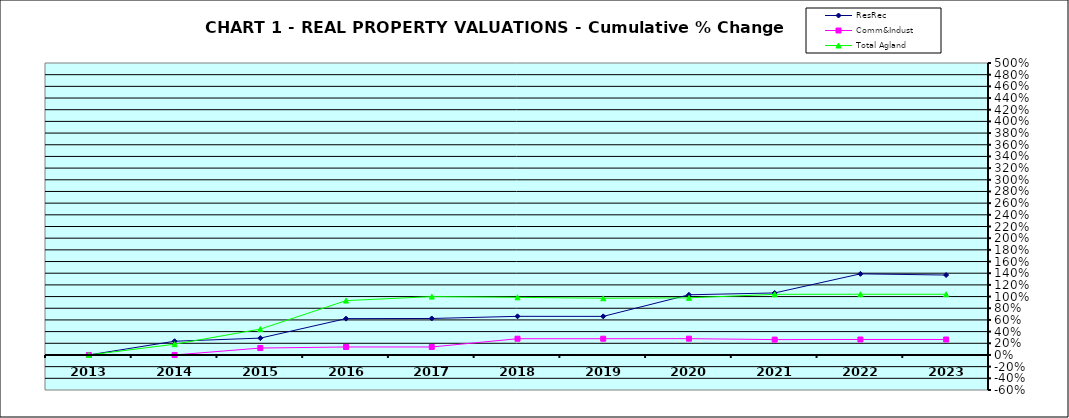
| Category | ResRec | Comm&Indust | Total Agland |
|---|---|---|---|
| 2013.0 | 0 | 0 | 0 |
| 2014.0 | 0.235 | 0 | 0.184 |
| 2015.0 | 0.288 | 0.119 | 0.443 |
| 2016.0 | 0.622 | 0.137 | 0.931 |
| 2017.0 | 0.625 | 0.137 | 0.999 |
| 2018.0 | 0.661 | 0.278 | 0.987 |
| 2019.0 | 0.661 | 0.278 | 0.971 |
| 2020.0 | 1.03 | 0.279 | 0.978 |
| 2021.0 | 1.062 | 0.263 | 1.038 |
| 2022.0 | 1.389 | 0.265 | 1.04 |
| 2023.0 | 1.369 | 0.265 | 1.04 |